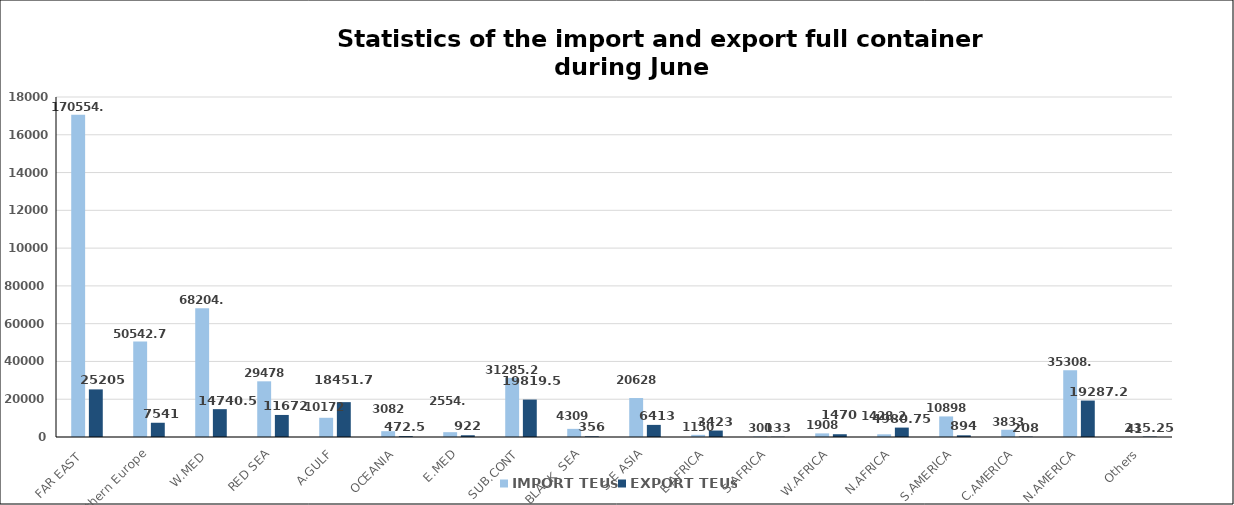
| Category | IMPORT | EXPORT |
|---|---|---|
| FAR EAST  | 170554.5 | 25205 |
| Northern Europe | 50542.75 | 7541 |
| W.MED  | 68204.5 | 14740.5 |
| RED SEA | 29478 | 11672 |
| A.GULF | 10172 | 18451.75 |
| OCEANIA | 3082 | 472.5 |
| E.MED | 2554.5 | 922 |
| SUB.CONT | 31285.25 | 19819.5 |
| BLACK  SEA | 4309 | 356 |
| S.E ASIA | 20628 | 6413 |
| E.AFRICA | 1150 | 3423 |
| S.AFRICA | 300 | 133 |
| W.AFRICA | 1908 | 1470 |
| N.AFRICA | 1428.25 | 4980.75 |
| S.AMERICA | 10898 | 894 |
| C.AMERICA | 3833 | 208 |
| N.AMERICA | 35308.5 | 19287.25 |
| Others | 41 | 235.25 |